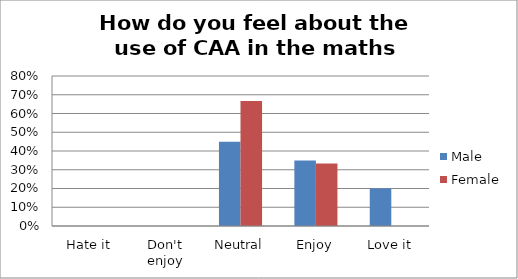
| Category | Male | Female |
|---|---|---|
| Hate it | 0 | 0 |
| Don't enjoy | 0 | 0 |
| Neutral | 0.45 | 0.667 |
| Enjoy | 0.35 | 0.333 |
| Love it | 0.2 | 0 |